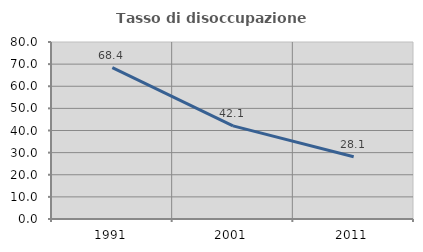
| Category | Tasso di disoccupazione giovanile  |
|---|---|
| 1991.0 | 68.421 |
| 2001.0 | 42.105 |
| 2011.0 | 28.125 |